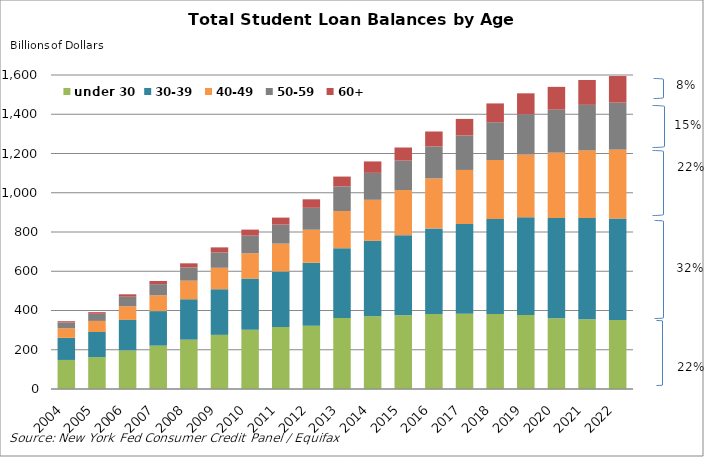
| Category | under 30 | 30-39 | 40-49 | 50-59 | 60+ |
|---|---|---|---|---|---|
| 2004.0 | 148.02 | 112.68 | 48.87 | 29.54 | 6.41 |
| 2005.0 | 162.8 | 127.72 | 56.38 | 36.47 | 8.27 |
| 2006.0 | 196.65 | 155.22 | 70.07 | 48.29 | 12.23 |
| 2007.0 | 220.85 | 176.13 | 80.48 | 56.76 | 15.97 |
| 2008.0 | 251.4 | 205.98 | 94.64 | 67.82 | 20.5 |
| 2009.0 | 275.92 | 232.49 | 109.24 | 78.6 | 25.34 |
| 2010.0 | 301.33 | 261.44 | 128.76 | 89.73 | 30.85 |
| 2011.0 | 316.54 | 282.25 | 141.91 | 97.1 | 35.47 |
| 2012.0 | 322.84 | 320.84 | 167.95 | 111.68 | 43.21 |
| 2013.0 | 362.21 | 355.14 | 189.33 | 125.65 | 50.11 |
| 2014.0 | 370.75 | 384.25 | 209.04 | 137.39 | 58.13 |
| 2015.0 | 376.19 | 407.79 | 229.86 | 149.9 | 66.78 |
| 2016.0 | 382.74 | 435.61 | 254.78 | 162.94 | 76.06 |
| 2017.0 | 383.16 | 457.21 | 275.83 | 175.43 | 84.59 |
| 2018.0 | 381.61 | 484.91 | 300.46 | 192.44 | 95.75 |
| 2019.0 | 376.69 | 497.9 | 319.52 | 206.23 | 106.27 |
| 2020.0 | 360.24 | 510.53 | 333.31 | 219.07 | 116.43 |
| 2021.0 | 355.62 | 515.59 | 344.83 | 231.89 | 126.61 |
| 2022.0 | 351.57 | 517.45 | 350.9 | 239.35 | 135.47 |